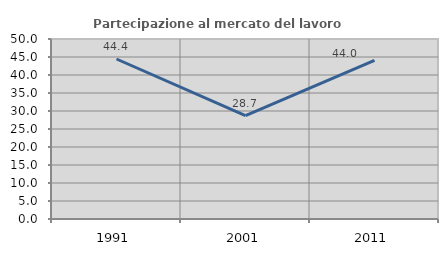
| Category | Partecipazione al mercato del lavoro  femminile |
|---|---|
| 1991.0 | 44.444 |
| 2001.0 | 28.736 |
| 2011.0 | 44.048 |